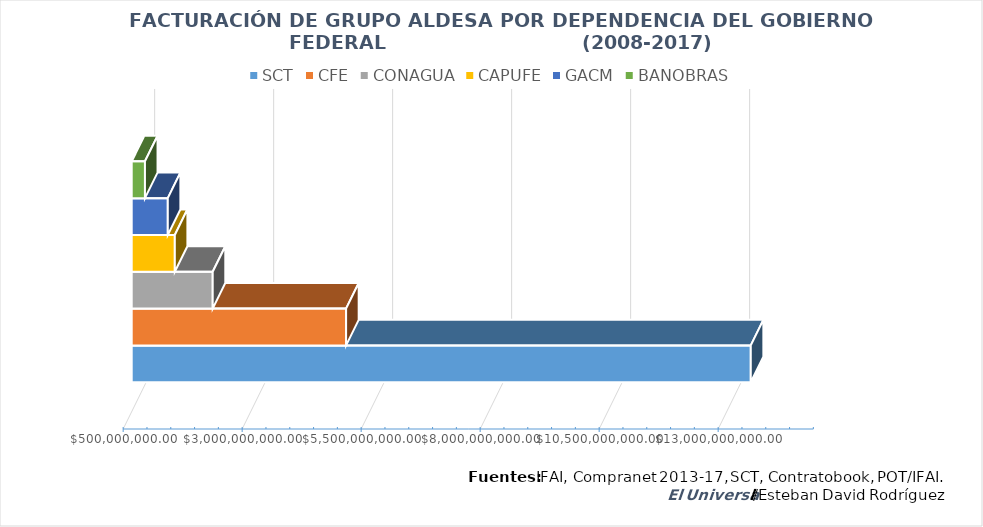
| Category | SCT | CFE | CONAGUA | CAPUFE | GACM | BANOBRAS |
|---|---|---|---|---|---|---|
| 0 | 13505934239.91 | 5004143851.21 | 2201696997.95 | 1405682800.6 | 1258171679.19 | 778402625.44 |